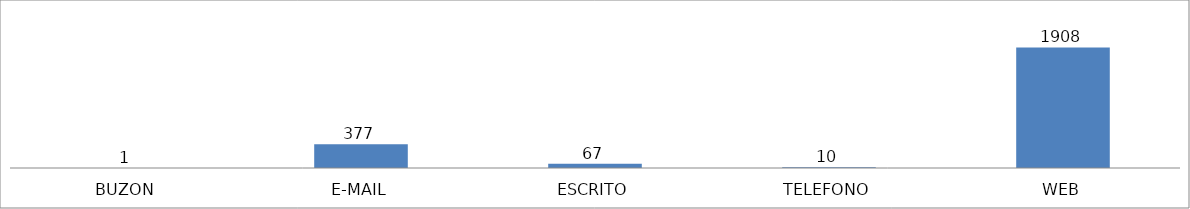
| Category | Series 0 |
|---|---|
| BUZON | 1 |
| E-MAIL | 377 |
| ESCRITO | 67 |
| TELEFONO | 10 |
| WEB | 1908 |